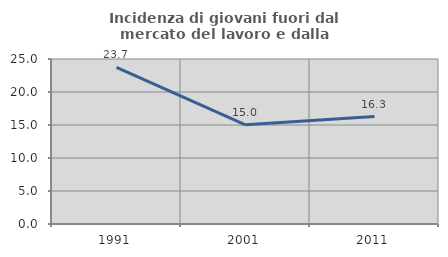
| Category | Incidenza di giovani fuori dal mercato del lavoro e dalla formazione  |
|---|---|
| 1991.0 | 23.731 |
| 2001.0 | 15.034 |
| 2011.0 | 16.282 |